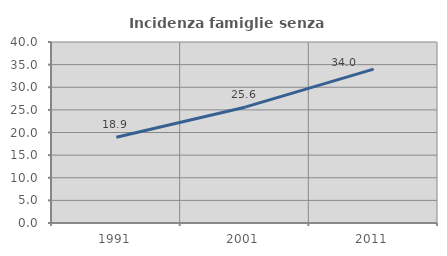
| Category | Incidenza famiglie senza nuclei |
|---|---|
| 1991.0 | 18.946 |
| 2001.0 | 25.597 |
| 2011.0 | 34.012 |